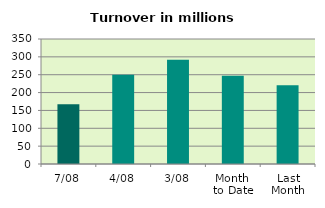
| Category | Series 0 |
|---|---|
| 7/08 | 167.1 |
| 4/08 | 249.666 |
| 3/08 | 291.654 |
| Month 
to Date | 247.388 |
| Last
Month | 220.762 |